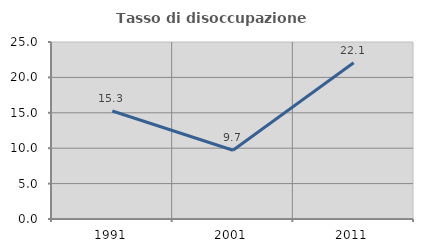
| Category | Tasso di disoccupazione giovanile  |
|---|---|
| 1991.0 | 15.254 |
| 2001.0 | 9.709 |
| 2011.0 | 22.059 |